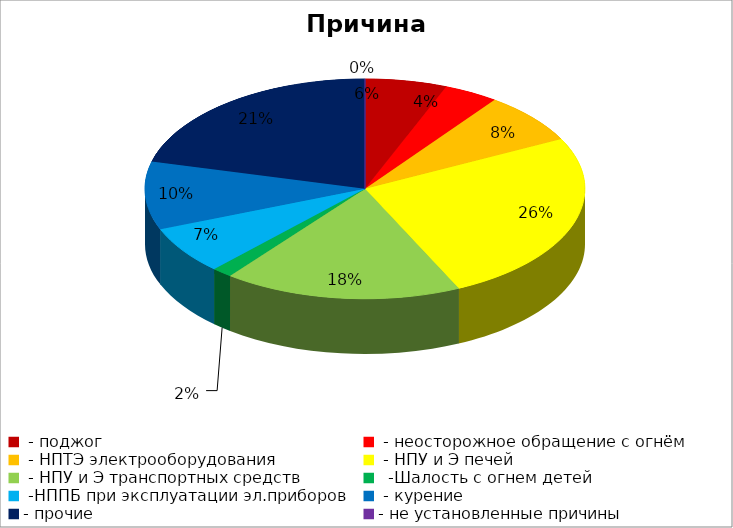
| Category | Причина пожара |
|---|---|
|  - поджог | 12 |
|  - неосторожное обращение с огнём | 8 |
|  - НПТЭ электрооборудования | 15 |
|  - НПУ и Э печей | 51 |
|  - НПУ и Э транспортных средств | 35 |
|   -Шалость с огнем детей | 3 |
|  -НППБ при эксплуатации эл.приборов | 14 |
|  - курение | 20 |
| - прочие | 42 |
| - не установленные причины | 0 |